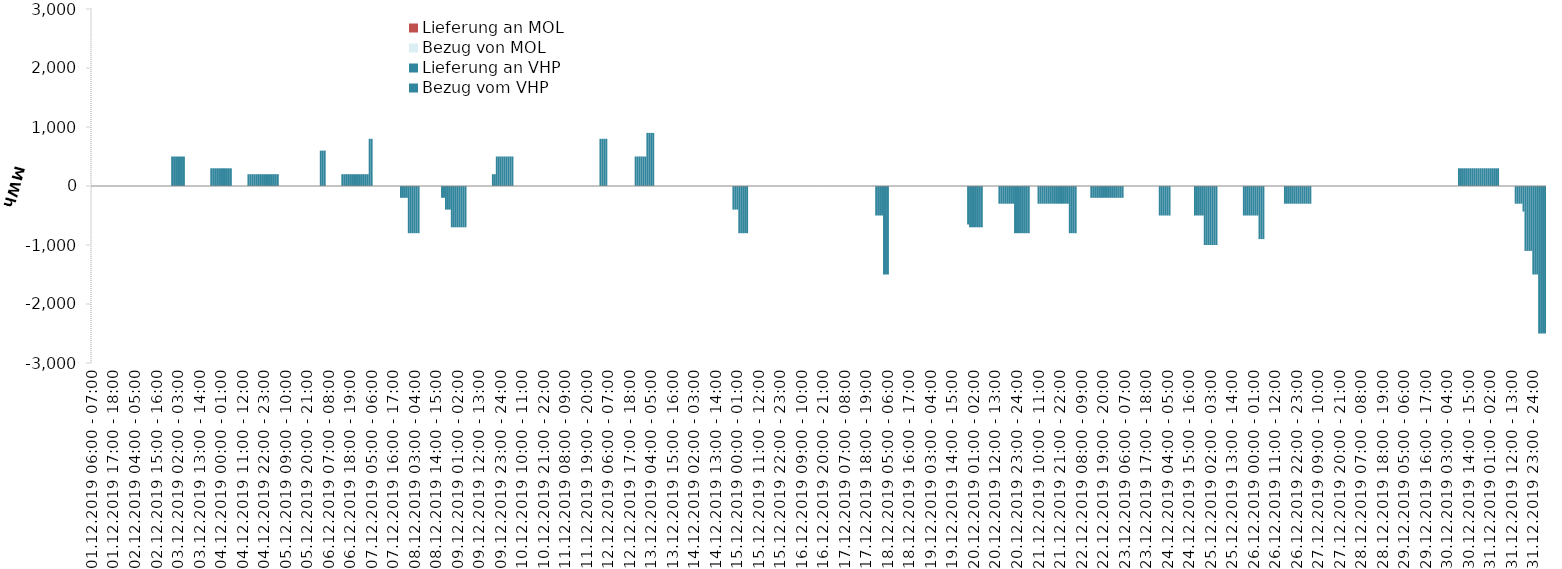
| Category | Bezug vom VHP | Lieferung an VHP | Bezug von MOL | Lieferung an MOL |
|---|---|---|---|---|
| 01.12.2019 06:00 - 07:00 | 0 | 0 | 0 | 0 |
| 01.12.2019 07:00 - 08:00 | 0 | 0 | 0 | 0 |
| 01.12.2019 08:00 - 09:00 | 0 | 0 | 0 | 0 |
| 01.12.2019 09:00 - 10:00 | 0 | 0 | 0 | 0 |
| 01.12.2019 10:00 - 11:00 | 0 | 0 | 0 | 0 |
| 01.12.2019 11:00 - 12:00 | 0 | 0 | 0 | 0 |
| 01.12.2019 12:00 - 13:00 | 0 | 0 | 0 | 0 |
| 01.12.2019 13:00 - 14:00 | 0 | 0 | 0 | 0 |
| 01.12.2019 14:00 - 15:00 | 0 | 0 | 0 | 0 |
| 01.12.2019 15:00 - 16:00 | 0 | 0 | 0 | 0 |
| 01.12.2019 16:00 - 17:00 | 0 | 0 | 0 | 0 |
| 01.12.2019 17:00 - 18:00 | 0 | 0 | 0 | 0 |
| 01.12.2019 18:00 - 19:00 | 0 | 0 | 0 | 0 |
| 01.12.2019 19:00 - 20:00 | 0 | 0 | 0 | 0 |
| 01.12.2019 20:00 - 21:00 | 0 | 0 | 0 | 0 |
| 01.12.2019 21:00 - 22:00 | 0 | 0 | 0 | 0 |
| 01.12.2019 22:00 - 23:00 | 0 | 0 | 0 | 0 |
| 01.12.2019 23:00 - 24:00 | 0 | 0 | 0 | 0 |
| 02.12.2019 00:00 - 01:00 | 0 | 0 | 0 | 0 |
| 02.12.2019 01:00 - 02:00 | 0 | 0 | 0 | 0 |
| 02.12.2019 02:00 - 03:00 | 0 | 0 | 0 | 0 |
| 02.12.2019 03:00 - 04:00 | 0 | 0 | 0 | 0 |
| 02.12.2019 04:00 - 05:00 | 0 | 0 | 0 | 0 |
| 02.12.2019 05:00 - 06:00 | 0 | 0 | 0 | 0 |
| 02.12.2019 06:00 - 07:00 | 0 | 0 | 0 | 0 |
| 02.12.2019 07:00 - 08:00 | 0 | 0 | 0 | 0 |
| 02.12.2019 08:00 - 09:00 | 0 | 0 | 0 | 0 |
| 02.12.2019 09:00 - 10:00 | 0 | 0 | 0 | 0 |
| 02.12.2019 10:00 - 11:00 | 0 | 0 | 0 | 0 |
| 02.12.2019 11:00 - 12:00 | 0 | 0 | 0 | 0 |
| 02.12.2019 12:00 - 13:00 | 0 | 0 | 0 | 0 |
| 02.12.2019 13:00 - 14:00 | 0 | 0 | 0 | 0 |
| 02.12.2019 14:00 - 15:00 | 0 | 0 | 0 | 0 |
| 02.12.2019 15:00 - 16:00 | 0 | 0 | 0 | 0 |
| 02.12.2019 16:00 - 17:00 | 0 | 0 | 0 | 0 |
| 02.12.2019 17:00 - 18:00 | 0 | 0 | 0 | 0 |
| 02.12.2019 18:00 - 19:00 | 0 | 0 | 0 | 0 |
| 02.12.2019 19:00 - 20:00 | 0 | 0 | 0 | 0 |
| 02.12.2019 20:00 - 21:00 | 0 | 0 | 0 | 0 |
| 02.12.2019 21:00 - 22:00 | 0 | 0 | 0 | 0 |
| 02.12.2019 22:00 - 23:00 | 0 | 0 | 0 | 0 |
| 02.12.2019 23:00 - 24:00 | 500 | 0 | 0 | 0 |
| 03.12.2019 00:00 - 01:00 | 500 | 0 | 0 | 0 |
| 03.12.2019 01:00 - 02:00 | 500 | 0 | 0 | 0 |
| 03.12.2019 02:00 - 03:00 | 500 | 0 | 0 | 0 |
| 03.12.2019 03:00 - 04:00 | 500 | 0 | 0 | 0 |
| 03.12.2019 04:00 - 05:00 | 500 | 0 | 0 | 0 |
| 03.12.2019 05:00 - 06:00 | 500 | 0 | 0 | 0 |
| 03.12.2019 06:00 - 07:00 | 0 | 0 | 0 | 0 |
| 03.12.2019 07:00 - 08:00 | 0 | 0 | 0 | 0 |
| 03.12.2019 08:00 - 09:00 | 0 | 0 | 0 | 0 |
| 03.12.2019 09:00 - 10:00 | 0 | 0 | 0 | 0 |
| 03.12.2019 10:00 - 11:00 | 0 | 0 | 0 | 0 |
| 03.12.2019 11:00 - 12:00 | 0 | 0 | 0 | 0 |
| 03.12.2019 12:00 - 13:00 | 0 | 0 | 0 | 0 |
| 03.12.2019 13:00 - 14:00 | 0 | 0 | 0 | 0 |
| 03.12.2019 14:00 - 15:00 | 0 | 0 | 0 | 0 |
| 03.12.2019 15:00 - 16:00 | 0 | 0 | 0 | 0 |
| 03.12.2019 16:00 - 17:00 | 0 | 0 | 0 | 0 |
| 03.12.2019 17:00 - 18:00 | 0 | 0 | 0 | 0 |
| 03.12.2019 18:00 - 19:00 | 0 | 0 | 0 | 0 |
| 03.12.2019 19:00 - 20:00 | 300 | 0 | 0 | 0 |
| 03.12.2019 20:00 - 21:00 | 300 | 0 | 0 | 0 |
| 03.12.2019 21:00 - 22:00 | 300 | 0 | 0 | 0 |
| 03.12.2019 22:00 - 23:00 | 300 | 0 | 0 | 0 |
| 03.12.2019 23:00 - 24:00 | 300 | 0 | 0 | 0 |
| 04.12.2019 00:00 - 01:00 | 300 | 0 | 0 | 0 |
| 04.12.2019 01:00 - 02:00 | 300 | 0 | 0 | 0 |
| 04.12.2019 02:00 - 03:00 | 300 | 0 | 0 | 0 |
| 04.12.2019 03:00 - 04:00 | 300 | 0 | 0 | 0 |
| 04.12.2019 04:00 - 05:00 | 300 | 0 | 0 | 0 |
| 04.12.2019 05:00 - 06:00 | 300 | 0 | 0 | 0 |
| 04.12.2019 06:00 - 07:00 | 0 | 0 | 0 | 0 |
| 04.12.2019 07:00 - 08:00 | 0 | 0 | 0 | 0 |
| 04.12.2019 08:00 - 09:00 | 0 | 0 | 0 | 0 |
| 04.12.2019 09:00 - 10:00 | 0 | 0 | 0 | 0 |
| 04.12.2019 10:00 - 11:00 | 0 | 0 | 0 | 0 |
| 04.12.2019 11:00 - 12:00 | 0 | 0 | 0 | 0 |
| 04.12.2019 12:00 - 13:00 | 0 | 0 | 0 | 0 |
| 04.12.2019 13:00 - 14:00 | 0 | 0 | 0 | 0 |
| 04.12.2019 14:00 - 15:00 | 200 | 0 | 0 | 0 |
| 04.12.2019 15:00 - 16:00 | 200 | 0 | 0 | 0 |
| 04.12.2019 16:00 - 17:00 | 200 | 0 | 0 | 0 |
| 04.12.2019 17:00 - 18:00 | 200 | 0 | 0 | 0 |
| 04.12.2019 18:00 - 19:00 | 200 | 0 | 0 | 0 |
| 04.12.2019 19:00 - 20:00 | 200 | 0 | 0 | 0 |
| 04.12.2019 20:00 - 21:00 | 200 | 0 | 0 | 0 |
| 04.12.2019 21:00 - 22:00 | 200 | 0 | 0 | 0 |
| 04.12.2019 22:00 - 23:00 | 200 | 0 | 0 | 0 |
| 04.12.2019 23:00 - 24:00 | 200 | 0 | 0 | 0 |
| 05.12.2019 00:00 - 01:00 | 200 | 0 | 0 | 0 |
| 05.12.2019 01:00 - 02:00 | 200 | 0 | 0 | 0 |
| 05.12.2019 02:00 - 03:00 | 200 | 0 | 0 | 0 |
| 05.12.2019 03:00 - 04:00 | 200 | 0 | 0 | 0 |
| 05.12.2019 04:00 - 05:00 | 200 | 0 | 0 | 0 |
| 05.12.2019 05:00 - 06:00 | 200 | 0 | 0 | 0 |
| 05.12.2019 06:00 - 07:00 | 0 | 0 | 0 | 0 |
| 05.12.2019 07:00 - 08:00 | 0 | 0 | 0 | 0 |
| 05.12.2019 08:00 - 09:00 | 0 | 0 | 0 | 0 |
| 05.12.2019 09:00 - 10:00 | 0 | 0 | 0 | 0 |
| 05.12.2019 10:00 - 11:00 | 0 | 0 | 0 | 0 |
| 05.12.2019 11:00 - 12:00 | 0 | 0 | 0 | 0 |
| 05.12.2019 12:00 - 13:00 | 0 | 0 | 0 | 0 |
| 05.12.2019 13:00 - 14:00 | 0 | 0 | 0 | 0 |
| 05.12.2019 14:00 - 15:00 | 0 | 0 | 0 | 0 |
| 05.12.2019 15:00 - 16:00 | 0 | 0 | 0 | 0 |
| 05.12.2019 16:00 - 17:00 | 0 | 0 | 0 | 0 |
| 05.12.2019 17:00 - 18:00 | 0 | 0 | 0 | 0 |
| 05.12.2019 18:00 - 19:00 | 0 | 0 | 0 | 0 |
| 05.12.2019 19:00 - 20:00 | 0 | 0 | 0 | 0 |
| 05.12.2019 20:00 - 21:00 | 0 | 0 | 0 | 0 |
| 05.12.2019 21:00 - 22:00 | 0 | 0 | 0 | 0 |
| 05.12.2019 22:00 - 23:00 | 0 | 0 | 0 | 0 |
| 05.12.2019 23:00 - 24:00 | 0 | 0 | 0 | 0 |
| 06.12.2019 00:00 - 01:00 | 0 | 0 | 0 | 0 |
| 06.12.2019 01:00 - 02:00 | 0 | 0 | 0 | 0 |
| 06.12.2019 02:00 - 03:00 | 0 | 0 | 0 | 0 |
| 06.12.2019 03:00 - 04:00 | 600 | 0 | 0 | 0 |
| 06.12.2019 04:00 - 05:00 | 600 | 0 | 0 | 0 |
| 06.12.2019 05:00 - 06:00 | 600 | 0 | 0 | 0 |
| 06.12.2019 06:00 - 07:00 | 0 | 0 | 0 | 0 |
| 06.12.2019 07:00 - 08:00 | 0 | 0 | 0 | 0 |
| 06.12.2019 08:00 - 09:00 | 0 | 0 | 0 | 0 |
| 06.12.2019 09:00 - 10:00 | 0 | 0 | 0 | 0 |
| 06.12.2019 10:00 - 11:00 | 0 | 0 | 0 | 0 |
| 06.12.2019 11:00 - 12:00 | 0 | 0 | 0 | 0 |
| 06.12.2019 12:00 - 13:00 | 0 | 0 | 0 | 0 |
| 06.12.2019 13:00 - 14:00 | 0 | 0 | 0 | 0 |
| 06.12.2019 14:00 - 15:00 | 200 | 0 | 0 | 0 |
| 06.12.2019 15:00 - 16:00 | 200 | 0 | 0 | 0 |
| 06.12.2019 16:00 - 17:00 | 200 | 0 | 0 | 0 |
| 06.12.2019 17:00 - 18:00 | 200 | 0 | 0 | 0 |
| 06.12.2019 18:00 - 19:00 | 200 | 0 | 0 | 0 |
| 06.12.2019 19:00 - 20:00 | 200 | 0 | 0 | 0 |
| 06.12.2019 20:00 - 21:00 | 200 | 0 | 0 | 0 |
| 06.12.2019 21:00 - 22:00 | 200 | 0 | 0 | 0 |
| 06.12.2019 22:00 - 23:00 | 200 | 0 | 0 | 0 |
| 06.12.2019 23:00 - 24:00 | 200 | 0 | 0 | 0 |
| 07.12.2019 00:00 - 01:00 | 200 | 0 | 0 | 0 |
| 07.12.2019 01:00 - 02:00 | 200 | 0 | 0 | 0 |
| 07.12.2019 02:00 - 03:00 | 200 | 0 | 0 | 0 |
| 07.12.2019 03:00 - 04:00 | 200 | 0 | 0 | 0 |
| 07.12.2019 04:00 - 05:00 | 800 | 0 | 0 | 0 |
| 07.12.2019 05:00 - 06:00 | 800 | 0 | 0 | 0 |
| 07.12.2019 06:00 - 07:00 | 0 | 0 | 0 | 0 |
| 07.12.2019 07:00 - 08:00 | 0 | 0 | 0 | 0 |
| 07.12.2019 08:00 - 09:00 | 0 | 0 | 0 | 0 |
| 07.12.2019 09:00 - 10:00 | 0 | 0 | 0 | 0 |
| 07.12.2019 10:00 - 11:00 | 0 | 0 | 0 | 0 |
| 07.12.2019 11:00 - 12:00 | 0 | 0 | 0 | 0 |
| 07.12.2019 12:00 - 13:00 | 0 | 0 | 0 | 0 |
| 07.12.2019 13:00 - 14:00 | 0 | 0 | 0 | 0 |
| 07.12.2019 14:00 - 15:00 | 0 | 0 | 0 | 0 |
| 07.12.2019 15:00 - 16:00 | 0 | 0 | 0 | 0 |
| 07.12.2019 16:00 - 17:00 | 0 | 0 | 0 | 0 |
| 07.12.2019 17:00 - 18:00 | 0 | 0 | 0 | 0 |
| 07.12.2019 18:00 - 19:00 | 0 | 0 | 0 | 0 |
| 07.12.2019 19:00 - 20:00 | 0 | 0 | 0 | 0 |
| 07.12.2019 20:00 - 21:00 | 0 | -200 | 0 | 0 |
| 07.12.2019 21:00 - 22:00 | 0 | -200 | 0 | 0 |
| 07.12.2019 22:00 - 23:00 | 0 | -200 | 0 | 0 |
| 07.12.2019 23:00 - 24:00 | 0 | -200 | 0 | 0 |
| 08.12.2019 00:00 - 01:00 | 0 | -800 | 0 | 0 |
| 08.12.2019 01:00 - 02:00 | 0 | -800 | 0 | 0 |
| 08.12.2019 02:00 - 03:00 | 0 | -800 | 0 | 0 |
| 08.12.2019 03:00 - 04:00 | 0 | -800 | 0 | 0 |
| 08.12.2019 04:00 - 05:00 | 0 | -800 | 0 | 0 |
| 08.12.2019 05:00 - 06:00 | 0 | -800 | 0 | 0 |
| 08.12.2019 06:00 - 07:00 | 0 | 0 | 0 | 0 |
| 08.12.2019 07:00 - 08:00 | 0 | 0 | 0 | 0 |
| 08.12.2019 08:00 - 09:00 | 0 | 0 | 0 | 0 |
| 08.12.2019 09:00 - 10:00 | 0 | 0 | 0 | 0 |
| 08.12.2019 10:00 - 11:00 | 0 | 0 | 0 | 0 |
| 08.12.2019 11:00 - 12:00 | 0 | 0 | 0 | 0 |
| 08.12.2019 12:00 - 13:00 | 0 | 0 | 0 | 0 |
| 08.12.2019 13:00 - 14:00 | 0 | 0 | 0 | 0 |
| 08.12.2019 14:00 - 15:00 | 0 | 0 | 0 | 0 |
| 08.12.2019 15:00 - 16:00 | 0 | 0 | 0 | 0 |
| 08.12.2019 16:00 - 17:00 | 0 | 0 | 0 | 0 |
| 08.12.2019 17:00 - 18:00 | 0 | -200 | 0 | 0 |
| 08.12.2019 18:00 - 19:00 | 0 | -200 | 0 | 0 |
| 08.12.2019 19:00 - 20:00 | 0 | -400 | 0 | 0 |
| 08.12.2019 20:00 - 21:00 | 0 | -400 | 0 | 0 |
| 08.12.2019 21:00 - 22:00 | 0 | -400 | 0 | 0 |
| 08.12.2019 22:00 - 23:00 | 0 | -700 | 0 | 0 |
| 08.12.2019 23:00 - 24:00 | 0 | -700 | 0 | 0 |
| 09.12.2019 00:00 - 01:00 | 0 | -700 | 0 | 0 |
| 09.12.2019 01:00 - 02:00 | 0 | -700 | 0 | 0 |
| 09.12.2019 02:00 - 03:00 | 0 | -700 | 0 | 0 |
| 09.12.2019 03:00 - 04:00 | 0 | -700 | 0 | 0 |
| 09.12.2019 04:00 - 05:00 | 0 | -700 | 0 | 0 |
| 09.12.2019 05:00 - 06:00 | 0 | -700 | 0 | 0 |
| 09.12.2019 06:00 - 07:00 | 0 | 0 | 0 | 0 |
| 09.12.2019 07:00 - 08:00 | 0 | 0 | 0 | 0 |
| 09.12.2019 08:00 - 09:00 | 0 | 0 | 0 | 0 |
| 09.12.2019 09:00 - 10:00 | 0 | 0 | 0 | 0 |
| 09.12.2019 10:00 - 11:00 | 0 | 0 | 0 | 0 |
| 09.12.2019 11:00 - 12:00 | 0 | 0 | 0 | 0 |
| 09.12.2019 12:00 - 13:00 | 0 | 0 | 0 | 0 |
| 09.12.2019 13:00 - 14:00 | 0 | 0 | 0 | 0 |
| 09.12.2019 14:00 - 15:00 | 0 | 0 | 0 | 0 |
| 09.12.2019 15:00 - 16:00 | 0 | 0 | 0 | 0 |
| 09.12.2019 16:00 - 17:00 | 0 | 0 | 0 | 0 |
| 09.12.2019 17:00 - 18:00 | 0 | 0 | 0 | 0 |
| 09.12.2019 18:00 - 19:00 | 0 | 0 | 0 | 0 |
| 09.12.2019 19:00 - 20:00 | 200 | 0 | 0 | 0 |
| 09.12.2019 20:00 - 21:00 | 200 | 0 | 0 | 0 |
| 09.12.2019 21:00 - 22:00 | 500 | 0 | 0 | 0 |
| 09.12.2019 22:00 - 23:00 | 500 | 0 | 0 | 0 |
| 09.12.2019 23:00 - 24:00 | 500 | 0 | 0 | 0 |
| 10.12.2019 00:00 - 01:00 | 500 | 0 | 0 | 0 |
| 10.12.2019 01:00 - 02:00 | 500 | 0 | 0 | 0 |
| 10.12.2019 02:00 - 03:00 | 500 | 0 | 0 | 0 |
| 10.12.2019 03:00 - 04:00 | 500 | 0 | 0 | 0 |
| 10.12.2019 04:00 - 05:00 | 500 | 0 | 0 | 0 |
| 10.12.2019 05:00 - 06:00 | 500 | 0 | 0 | 0 |
| 10.12.2019 06:00 - 07:00 | 0 | 0 | 0 | 0 |
| 10.12.2019 07:00 - 08:00 | 0 | 0 | 0 | 0 |
| 10.12.2019 08:00 - 09:00 | 0 | 0 | 0 | 0 |
| 10.12.2019 09:00 - 10:00 | 0 | 0 | 0 | 0 |
| 10.12.2019 10:00 - 11:00 | 0 | 0 | 0 | 0 |
| 10.12.2019 11:00 - 12:00 | 0 | 0 | 0 | 0 |
| 10.12.2019 12:00 - 13:00 | 0 | 0 | 0 | 0 |
| 10.12.2019 13:00 - 14:00 | 0 | 0 | 0 | 0 |
| 10.12.2019 14:00 - 15:00 | 0 | 0 | 0 | 0 |
| 10.12.2019 15:00 - 16:00 | 0 | 0 | 0 | 0 |
| 10.12.2019 16:00 - 17:00 | 0 | 0 | 0 | 0 |
| 10.12.2019 17:00 - 18:00 | 0 | 0 | 0 | 0 |
| 10.12.2019 18:00 - 19:00 | 0 | 0 | 0 | 0 |
| 10.12.2019 19:00 - 20:00 | 0 | 0 | 0 | 0 |
| 10.12.2019 20:00 - 21:00 | 0 | 0 | 0 | 0 |
| 10.12.2019 21:00 - 22:00 | 0 | 0 | 0 | 0 |
| 10.12.2019 22:00 - 23:00 | 0 | 0 | 0 | 0 |
| 10.12.2019 23:00 - 24:00 | 0 | 0 | 0 | 0 |
| 11.12.2019 00:00 - 01:00 | 0 | 0 | 0 | 0 |
| 11.12.2019 01:00 - 02:00 | 0 | 0 | 0 | 0 |
| 11.12.2019 02:00 - 03:00 | 0 | 0 | 0 | 0 |
| 11.12.2019 03:00 - 04:00 | 0 | 0 | 0 | 0 |
| 11.12.2019 04:00 - 05:00 | 0 | 0 | 0 | 0 |
| 11.12.2019 05:00 - 06:00 | 0 | 0 | 0 | 0 |
| 11.12.2019 06:00 - 07:00 | 0 | 0 | 0 | 0 |
| 11.12.2019 07:00 - 08:00 | 0 | 0 | 0 | 0 |
| 11.12.2019 08:00 - 09:00 | 0 | 0 | 0 | 0 |
| 11.12.2019 09:00 - 10:00 | 0 | 0 | 0 | 0 |
| 11.12.2019 10:00 - 11:00 | 0 | 0 | 0 | 0 |
| 11.12.2019 11:00 - 12:00 | 0 | 0 | 0 | 0 |
| 11.12.2019 12:00 - 13:00 | 0 | 0 | 0 | 0 |
| 11.12.2019 13:00 - 14:00 | 0 | 0 | 0 | 0 |
| 11.12.2019 14:00 - 15:00 | 0 | 0 | 0 | 0 |
| 11.12.2019 15:00 - 16:00 | 0 | 0 | 0 | 0 |
| 11.12.2019 16:00 - 17:00 | 0 | 0 | 0 | 0 |
| 11.12.2019 17:00 - 18:00 | 0 | 0 | 0 | 0 |
| 11.12.2019 18:00 - 19:00 | 0 | 0 | 0 | 0 |
| 11.12.2019 19:00 - 20:00 | 0 | 0 | 0 | 0 |
| 11.12.2019 20:00 - 21:00 | 0 | 0 | 0 | 0 |
| 11.12.2019 21:00 - 22:00 | 0 | 0 | 0 | 0 |
| 11.12.2019 22:00 - 23:00 | 0 | 0 | 0 | 0 |
| 11.12.2019 23:00 - 24:00 | 0 | 0 | 0 | 0 |
| 12.12.2019 00:00 - 01:00 | 0 | 0 | 0 | 0 |
| 12.12.2019 01:00 - 02:00 | 0 | 0 | 0 | 0 |
| 12.12.2019 02:00 - 03:00 | 800 | 0 | 0 | 0 |
| 12.12.2019 03:00 - 04:00 | 800 | 0 | 0 | 0 |
| 12.12.2019 04:00 - 05:00 | 800 | 0 | 0 | 0 |
| 12.12.2019 05:00 - 06:00 | 800 | 0 | 0 | 0 |
| 12.12.2019 06:00 - 07:00 | 0 | 0 | 0 | 0 |
| 12.12.2019 07:00 - 08:00 | 0 | 0 | 0 | 0 |
| 12.12.2019 08:00 - 09:00 | 0 | 0 | 0 | 0 |
| 12.12.2019 09:00 - 10:00 | 0 | 0 | 0 | 0 |
| 12.12.2019 10:00 - 11:00 | 0 | 0 | 0 | 0 |
| 12.12.2019 11:00 - 12:00 | 0 | 0 | 0 | 0 |
| 12.12.2019 12:00 - 13:00 | 0 | 0 | 0 | 0 |
| 12.12.2019 13:00 - 14:00 | 0 | 0 | 0 | 0 |
| 12.12.2019 14:00 - 15:00 | 0 | 0 | 0 | 0 |
| 12.12.2019 15:00 - 16:00 | 0 | 0 | 0 | 0 |
| 12.12.2019 16:00 - 17:00 | 0 | 0 | 0 | 0 |
| 12.12.2019 17:00 - 18:00 | 0 | 0 | 0 | 0 |
| 12.12.2019 18:00 - 19:00 | 0 | 0 | 0 | 0 |
| 12.12.2019 19:00 - 20:00 | 0 | 0 | 0 | 0 |
| 12.12.2019 20:00 - 21:00 | 500 | 0 | 0 | 0 |
| 12.12.2019 21:00 - 22:00 | 500 | 0 | 0 | 0 |
| 12.12.2019 22:00 - 23:00 | 500 | 0 | 0 | 0 |
| 12.12.2019 23:00 - 24:00 | 500 | 0 | 0 | 0 |
| 13.12.2019 00:00 - 01:00 | 500 | 0 | 0 | 0 |
| 13.12.2019 01:00 - 02:00 | 500 | 0 | 0 | 0 |
| 13.12.2019 02:00 - 03:00 | 900 | 0 | 0 | 0 |
| 13.12.2019 03:00 - 04:00 | 900 | 0 | 0 | 0 |
| 13.12.2019 04:00 - 05:00 | 900 | 0 | 0 | 0 |
| 13.12.2019 05:00 - 06:00 | 900 | 0 | 0 | 0 |
| 13.12.2019 06:00 - 07:00 | 0 | 0 | 0 | 0 |
| 13.12.2019 07:00 - 08:00 | 0 | 0 | 0 | 0 |
| 13.12.2019 08:00 - 09:00 | 0 | 0 | 0 | 0 |
| 13.12.2019 09:00 - 10:00 | 0 | 0 | 0 | 0 |
| 13.12.2019 10:00 - 11:00 | 0 | 0 | 0 | 0 |
| 13.12.2019 11:00 - 12:00 | 0 | 0 | 0 | 0 |
| 13.12.2019 12:00 - 13:00 | 0 | 0 | 0 | 0 |
| 13.12.2019 13:00 - 14:00 | 0 | 0 | 0 | 0 |
| 13.12.2019 14:00 - 15:00 | 0 | 0 | 0 | 0 |
| 13.12.2019 15:00 - 16:00 | 0 | 0 | 0 | 0 |
| 13.12.2019 16:00 - 17:00 | 0 | 0 | 0 | 0 |
| 13.12.2019 17:00 - 18:00 | 0 | 0 | 0 | 0 |
| 13.12.2019 18:00 - 19:00 | 0 | 0 | 0 | 0 |
| 13.12.2019 19:00 - 20:00 | 0 | 0 | 0 | 0 |
| 13.12.2019 20:00 - 21:00 | 0 | 0 | 0 | 0 |
| 13.12.2019 21:00 - 22:00 | 0 | 0 | 0 | 0 |
| 13.12.2019 22:00 - 23:00 | 0 | 0 | 0 | 0 |
| 13.12.2019 23:00 - 24:00 | 0 | 0 | 0 | 0 |
| 14.12.2019 00:00 - 01:00 | 0 | 0 | 0 | 0 |
| 14.12.2019 01:00 - 02:00 | 0 | 0 | 0 | 0 |
| 14.12.2019 02:00 - 03:00 | 0 | 0 | 0 | 0 |
| 14.12.2019 03:00 - 04:00 | 0 | 0 | 0 | 0 |
| 14.12.2019 04:00 - 05:00 | 0 | 0 | 0 | 0 |
| 14.12.2019 05:00 - 06:00 | 0 | 0 | 0 | 0 |
| 14.12.2019 06:00 - 07:00 | 0 | 0 | 0 | 0 |
| 14.12.2019 07:00 - 08:00 | 0 | 0 | 0 | 0 |
| 14.12.2019 08:00 - 09:00 | 0 | 0 | 0 | 0 |
| 14.12.2019 09:00 - 10:00 | 0 | 0 | 0 | 0 |
| 14.12.2019 10:00 - 11:00 | 0 | 0 | 0 | 0 |
| 14.12.2019 11:00 - 12:00 | 0 | 0 | 0 | 0 |
| 14.12.2019 12:00 - 13:00 | 0 | 0 | 0 | 0 |
| 14.12.2019 13:00 - 14:00 | 0 | 0 | 0 | 0 |
| 14.12.2019 14:00 - 15:00 | 0 | 0 | 0 | 0 |
| 14.12.2019 15:00 - 16:00 | 0 | 0 | 0 | 0 |
| 14.12.2019 16:00 - 17:00 | 0 | 0 | 0 | 0 |
| 14.12.2019 17:00 - 18:00 | 0 | 0 | 0 | 0 |
| 14.12.2019 18:00 - 19:00 | 0 | 0 | 0 | 0 |
| 14.12.2019 19:00 - 20:00 | 0 | 0 | 0 | 0 |
| 14.12.2019 20:00 - 21:00 | 0 | 0 | 0 | 0 |
| 14.12.2019 21:00 - 22:00 | 0 | 0 | 0 | 0 |
| 14.12.2019 22:00 - 23:00 | 0 | -400 | 0 | 0 |
| 14.12.2019 23:00 - 24:00 | 0 | -400 | 0 | 0 |
| 15.12.2019 00:00 - 01:00 | 0 | -400 | 0 | 0 |
| 15.12.2019 01:00 - 02:00 | 0 | -800 | 0 | 0 |
| 15.12.2019 02:00 - 03:00 | 0 | -800 | 0 | 0 |
| 15.12.2019 03:00 - 04:00 | 0 | -800 | 0 | 0 |
| 15.12.2019 04:00 - 05:00 | 0 | -800 | 0 | 0 |
| 15.12.2019 05:00 - 06:00 | 0 | -800 | 0 | 0 |
| 15.12.2019 06:00 - 07:00 | 0 | 0 | 0 | 0 |
| 15.12.2019 07:00 - 08:00 | 0 | 0 | 0 | 0 |
| 15.12.2019 08:00 - 09:00 | 0 | 0 | 0 | 0 |
| 15.12.2019 09:00 - 10:00 | 0 | 0 | 0 | 0 |
| 15.12.2019 10:00 - 11:00 | 0 | 0 | 0 | 0 |
| 15.12.2019 11:00 - 12:00 | 0 | 0 | 0 | 0 |
| 15.12.2019 12:00 - 13:00 | 0 | 0 | 0 | 0 |
| 15.12.2019 13:00 - 14:00 | 0 | 0 | 0 | 0 |
| 15.12.2019 14:00 - 15:00 | 0 | 0 | 0 | 0 |
| 15.12.2019 15:00 - 16:00 | 0 | 0 | 0 | 0 |
| 15.12.2019 16:00 - 17:00 | 0 | 0 | 0 | 0 |
| 15.12.2019 17:00 - 18:00 | 0 | 0 | 0 | 0 |
| 15.12.2019 18:00 - 19:00 | 0 | 0 | 0 | 0 |
| 15.12.2019 19:00 - 20:00 | 0 | 0 | 0 | 0 |
| 15.12.2019 20:00 - 21:00 | 0 | 0 | 0 | 0 |
| 15.12.2019 21:00 - 22:00 | 0 | 0 | 0 | 0 |
| 15.12.2019 22:00 - 23:00 | 0 | 0 | 0 | 0 |
| 15.12.2019 23:00 - 24:00 | 0 | 0 | 0 | 0 |
| 16.12.2019 00:00 - 01:00 | 0 | 0 | 0 | 0 |
| 16.12.2019 01:00 - 02:00 | 0 | 0 | 0 | 0 |
| 16.12.2019 02:00 - 03:00 | 0 | 0 | 0 | 0 |
| 16.12.2019 03:00 - 04:00 | 0 | 0 | 0 | 0 |
| 16.12.2019 04:00 - 05:00 | 0 | 0 | 0 | 0 |
| 16.12.2019 05:00 - 06:00 | 0 | 0 | 0 | 0 |
| 16.12.2019 06:00 - 07:00 | 0 | 0 | 0 | 0 |
| 16.12.2019 07:00 - 08:00 | 0 | 0 | 0 | 0 |
| 16.12.2019 08:00 - 09:00 | 0 | 0 | 0 | 0 |
| 16.12.2019 09:00 - 10:00 | 0 | 0 | 0 | 0 |
| 16.12.2019 10:00 - 11:00 | 0 | 0 | 0 | 0 |
| 16.12.2019 11:00 - 12:00 | 0 | 0 | 0 | 0 |
| 16.12.2019 12:00 - 13:00 | 0 | 0 | 0 | 0 |
| 16.12.2019 13:00 - 14:00 | 0 | 0 | 0 | 0 |
| 16.12.2019 14:00 - 15:00 | 0 | 0 | 0 | 0 |
| 16.12.2019 15:00 - 16:00 | 0 | 0 | 0 | 0 |
| 16.12.2019 16:00 - 17:00 | 0 | 0 | 0 | 0 |
| 16.12.2019 17:00 - 18:00 | 0 | 0 | 0 | 0 |
| 16.12.2019 18:00 - 19:00 | 0 | 0 | 0 | 0 |
| 16.12.2019 19:00 - 20:00 | 0 | 0 | 0 | 0 |
| 16.12.2019 20:00 - 21:00 | 0 | 0 | 0 | 0 |
| 16.12.2019 21:00 - 22:00 | 0 | 0 | 0 | 0 |
| 16.12.2019 22:00 - 23:00 | 0 | 0 | 0 | 0 |
| 16.12.2019 23:00 - 24:00 | 0 | 0 | 0 | 0 |
| 17.12.2019 00:00 - 01:00 | 0 | 0 | 0 | 0 |
| 17.12.2019 01:00 - 02:00 | 0 | 0 | 0 | 0 |
| 17.12.2019 02:00 - 03:00 | 0 | 0 | 0 | 0 |
| 17.12.2019 03:00 - 04:00 | 0 | 0 | 0 | 0 |
| 17.12.2019 04:00 - 05:00 | 0 | 0 | 0 | 0 |
| 17.12.2019 05:00 - 06:00 | 0 | 0 | 0 | 0 |
| 17.12.2019 06:00 - 07:00 | 0 | 0 | 0 | 0 |
| 17.12.2019 07:00 - 08:00 | 0 | 0 | 0 | 0 |
| 17.12.2019 08:00 - 09:00 | 0 | 0 | 0 | 0 |
| 17.12.2019 09:00 - 10:00 | 0 | 0 | 0 | 0 |
| 17.12.2019 10:00 - 11:00 | 0 | 0 | 0 | 0 |
| 17.12.2019 11:00 - 12:00 | 0 | 0 | 0 | 0 |
| 17.12.2019 12:00 - 13:00 | 0 | 0 | 0 | 0 |
| 17.12.2019 13:00 - 14:00 | 0 | 0 | 0 | 0 |
| 17.12.2019 14:00 - 15:00 | 0 | 0 | 0 | 0 |
| 17.12.2019 15:00 - 16:00 | 0 | 0 | 0 | 0 |
| 17.12.2019 16:00 - 17:00 | 0 | 0 | 0 | 0 |
| 17.12.2019 17:00 - 18:00 | 0 | 0 | 0 | 0 |
| 17.12.2019 18:00 - 19:00 | 0 | 0 | 0 | 0 |
| 17.12.2019 19:00 - 20:00 | 0 | 0 | 0 | 0 |
| 17.12.2019 20:00 - 21:00 | 0 | 0 | 0 | 0 |
| 17.12.2019 21:00 - 22:00 | 0 | 0 | 0 | 0 |
| 17.12.2019 22:00 - 23:00 | 0 | 0 | 0 | 0 |
| 17.12.2019 23:00 - 24:00 | 0 | -500 | 0 | 0 |
| 18.12.2019 00:00 - 01:00 | 0 | -500 | 0 | 0 |
| 18.12.2019 01:00 - 02:00 | 0 | -500 | 0 | 0 |
| 18.12.2019 02:00 - 03:00 | 0 | -500 | 0 | 0 |
| 18.12.2019 03:00 - 04:00 | 0 | -1500 | 0 | 0 |
| 18.12.2019 04:00 - 05:00 | 0 | -1500 | 0 | 0 |
| 18.12.2019 05:00 - 06:00 | 0 | -1500 | 0 | 0 |
| 18.12.2019 06:00 - 07:00 | 0 | 0 | 0 | 0 |
| 18.12.2019 07:00 - 08:00 | 0 | 0 | 0 | 0 |
| 18.12.2019 08:00 - 09:00 | 0 | 0 | 0 | 0 |
| 18.12.2019 09:00 - 10:00 | 0 | 0 | 0 | 0 |
| 18.12.2019 10:00 - 11:00 | 0 | 0 | 0 | 0 |
| 18.12.2019 11:00 - 12:00 | 0 | 0 | 0 | 0 |
| 18.12.2019 12:00 - 13:00 | 0 | 0 | 0 | 0 |
| 18.12.2019 13:00 - 14:00 | 0 | 0 | 0 | 0 |
| 18.12.2019 14:00 - 15:00 | 0 | 0 | 0 | 0 |
| 18.12.2019 15:00 - 16:00 | 0 | 0 | 0 | 0 |
| 18.12.2019 16:00 - 17:00 | 0 | 0 | 0 | 0 |
| 18.12.2019 17:00 - 18:00 | 0 | 0 | 0 | 0 |
| 18.12.2019 18:00 - 19:00 | 0 | 0 | 0 | 0 |
| 18.12.2019 19:00 - 20:00 | 0 | 0 | 0 | 0 |
| 18.12.2019 20:00 - 21:00 | 0 | 0 | 0 | 0 |
| 18.12.2019 21:00 - 22:00 | 0 | 0 | 0 | 0 |
| 18.12.2019 22:00 - 23:00 | 0 | 0 | 0 | 0 |
| 18.12.2019 23:00 - 24:00 | 0 | 0 | 0 | 0 |
| 19.12.2019 00:00 - 01:00 | 0 | 0 | 0 | 0 |
| 19.12.2019 01:00 - 02:00 | 0 | 0 | 0 | 0 |
| 19.12.2019 02:00 - 03:00 | 0 | 0 | 0 | 0 |
| 19.12.2019 03:00 - 04:00 | 0 | 0 | 0 | 0 |
| 19.12.2019 04:00 - 05:00 | 0 | 0 | 0 | 0 |
| 19.12.2019 05:00 - 06:00 | 0 | 0 | 0 | 0 |
| 19.12.2019 06:00 - 07:00 | 0 | 0 | 0 | 0 |
| 19.12.2019 07:00 - 08:00 | 0 | 0 | 0 | 0 |
| 19.12.2019 08:00 - 09:00 | 0 | 0 | 0 | 0 |
| 19.12.2019 09:00 - 10:00 | 0 | 0 | 0 | 0 |
| 19.12.2019 10:00 - 11:00 | 0 | 0 | 0 | 0 |
| 19.12.2019 11:00 - 12:00 | 0 | 0 | 0 | 0 |
| 19.12.2019 12:00 - 13:00 | 0 | 0 | 0 | 0 |
| 19.12.2019 13:00 - 14:00 | 0 | 0 | 0 | 0 |
| 19.12.2019 14:00 - 15:00 | 0 | 0 | 0 | 0 |
| 19.12.2019 15:00 - 16:00 | 0 | 0 | 0 | 0 |
| 19.12.2019 16:00 - 17:00 | 0 | 0 | 0 | 0 |
| 19.12.2019 17:00 - 18:00 | 0 | 0 | 0 | 0 |
| 19.12.2019 18:00 - 19:00 | 0 | 0 | 0 | 0 |
| 19.12.2019 19:00 - 20:00 | 0 | 0 | 0 | 0 |
| 19.12.2019 20:00 - 21:00 | 0 | 0 | 0 | 0 |
| 19.12.2019 21:00 - 22:00 | 0 | 0 | 0 | 0 |
| 19.12.2019 22:00 - 23:00 | 0 | -652 | 0 | 0 |
| 19.12.2019 23:00 - 24:00 | 0 | -700 | 0 | 0 |
| 20.12.2019 00:00 - 01:00 | 0 | -700 | 0 | 0 |
| 20.12.2019 01:00 - 02:00 | 0 | -700 | 0 | 0 |
| 20.12.2019 02:00 - 03:00 | 0 | -700 | 0 | 0 |
| 20.12.2019 03:00 - 04:00 | 0 | -700 | 0 | 0 |
| 20.12.2019 04:00 - 05:00 | 0 | -700 | 0 | 0 |
| 20.12.2019 05:00 - 06:00 | 0 | -700 | 0 | 0 |
| 20.12.2019 06:00 - 07:00 | 0 | 0 | 0 | 0 |
| 20.12.2019 07:00 - 08:00 | 0 | 0 | 0 | 0 |
| 20.12.2019 08:00 - 09:00 | 0 | 0 | 0 | 0 |
| 20.12.2019 09:00 - 10:00 | 0 | 0 | 0 | 0 |
| 20.12.2019 10:00 - 11:00 | 0 | 0 | 0 | 0 |
| 20.12.2019 11:00 - 12:00 | 0 | 0 | 0 | 0 |
| 20.12.2019 12:00 - 13:00 | 0 | 0 | 0 | 0 |
| 20.12.2019 13:00 - 14:00 | 0 | 0 | 0 | 0 |
| 20.12.2019 14:00 - 15:00 | 0 | -300 | 0 | 0 |
| 20.12.2019 15:00 - 16:00 | 0 | -300 | 0 | 0 |
| 20.12.2019 16:00 - 17:00 | 0 | -300 | 0 | 0 |
| 20.12.2019 17:00 - 18:00 | 0 | -300 | 0 | 0 |
| 20.12.2019 18:00 - 19:00 | 0 | -300 | 0 | 0 |
| 20.12.2019 19:00 - 20:00 | 0 | -300 | 0 | 0 |
| 20.12.2019 20:00 - 21:00 | 0 | -300 | 0 | 0 |
| 20.12.2019 21:00 - 22:00 | 0 | -300 | 0 | 0 |
| 20.12.2019 22:00 - 23:00 | 0 | -800 | 0 | 0 |
| 20.12.2019 23:00 - 24:00 | 0 | -800 | 0 | 0 |
| 21.12.2019 00:00 - 01:00 | 0 | -800 | 0 | 0 |
| 21.12.2019 01:00 - 02:00 | 0 | -800 | 0 | 0 |
| 21.12.2019 02:00 - 03:00 | 0 | -800 | 0 | 0 |
| 21.12.2019 03:00 - 04:00 | 0 | -800 | 0 | 0 |
| 21.12.2019 04:00 - 05:00 | 0 | -800 | 0 | 0 |
| 21.12.2019 05:00 - 06:00 | 0 | -800 | 0 | 0 |
| 21.12.2019 06:00 - 07:00 | 0 | 0 | 0 | 0 |
| 21.12.2019 07:00 - 08:00 | 0 | 0 | 0 | 0 |
| 21.12.2019 08:00 - 09:00 | 0 | 0 | 0 | 0 |
| 21.12.2019 09:00 - 10:00 | 0 | 0 | 0 | 0 |
| 21.12.2019 10:00 - 11:00 | 0 | -300 | 0 | 0 |
| 21.12.2019 11:00 - 12:00 | 0 | -300 | 0 | 0 |
| 21.12.2019 12:00 - 13:00 | 0 | -300 | 0 | 0 |
| 21.12.2019 13:00 - 14:00 | 0 | -300 | 0 | 0 |
| 21.12.2019 14:00 - 15:00 | 0 | -300 | 0 | 0 |
| 21.12.2019 15:00 - 16:00 | 0 | -300 | 0 | 0 |
| 21.12.2019 16:00 - 17:00 | 0 | -300 | 0 | 0 |
| 21.12.2019 17:00 - 18:00 | 0 | -300 | 0 | 0 |
| 21.12.2019 18:00 - 19:00 | 0 | -300 | 0 | 0 |
| 21.12.2019 19:00 - 20:00 | 0 | -300 | 0 | 0 |
| 21.12.2019 20:00 - 21:00 | 0 | -300 | 0 | 0 |
| 21.12.2019 21:00 - 22:00 | 0 | -300 | 0 | 0 |
| 21.12.2019 22:00 - 23:00 | 0 | -300 | 0 | 0 |
| 21.12.2019 23:00 - 24:00 | 0 | -300 | 0 | 0 |
| 22.12.2019 00:00 - 01:00 | 0 | -300 | 0 | 0 |
| 22.12.2019 01:00 - 02:00 | 0 | -300 | 0 | 0 |
| 22.12.2019 02:00 - 03:00 | 0 | -800 | 0 | 0 |
| 22.12.2019 03:00 - 04:00 | 0 | -800 | 0 | 0 |
| 22.12.2019 04:00 - 05:00 | 0 | -800 | 0 | 0 |
| 22.12.2019 05:00 - 06:00 | 0 | -800 | 0 | 0 |
| 22.12.2019 06:00 - 07:00 | 0 | 0 | 0 | 0 |
| 22.12.2019 07:00 - 08:00 | 0 | 0 | 0 | 0 |
| 22.12.2019 08:00 - 09:00 | 0 | 0 | 0 | 0 |
| 22.12.2019 09:00 - 10:00 | 0 | 0 | 0 | 0 |
| 22.12.2019 10:00 - 11:00 | 0 | 0 | 0 | 0 |
| 22.12.2019 11:00 - 12:00 | 0 | 0 | 0 | 0 |
| 22.12.2019 12:00 - 13:00 | 0 | 0 | 0 | 0 |
| 22.12.2019 13:00 - 14:00 | 0 | -200 | 0 | 0 |
| 22.12.2019 14:00 - 15:00 | 0 | -200 | 0 | 0 |
| 22.12.2019 15:00 - 16:00 | 0 | -200 | 0 | 0 |
| 22.12.2019 16:00 - 17:00 | 0 | -200 | 0 | 0 |
| 22.12.2019 17:00 - 18:00 | 0 | -200 | 0 | 0 |
| 22.12.2019 18:00 - 19:00 | 0 | -200 | 0 | 0 |
| 22.12.2019 19:00 - 20:00 | 0 | -200 | 0 | 0 |
| 22.12.2019 20:00 - 21:00 | 0 | -200 | 0 | 0 |
| 22.12.2019 21:00 - 22:00 | 0 | -200 | 0 | 0 |
| 22.12.2019 22:00 - 23:00 | 0 | -200 | 0 | 0 |
| 22.12.2019 23:00 - 24:00 | 0 | -200 | 0 | 0 |
| 23.12.2019 00:00 - 01:00 | 0 | -200 | 0 | 0 |
| 23.12.2019 01:00 - 02:00 | 0 | -200 | 0 | 0 |
| 23.12.2019 02:00 - 03:00 | 0 | -200 | 0 | 0 |
| 23.12.2019 03:00 - 04:00 | 0 | -200 | 0 | 0 |
| 23.12.2019 04:00 - 05:00 | 0 | -200 | 0 | 0 |
| 23.12.2019 05:00 - 06:00 | 0 | -200 | 0 | 0 |
| 23.12.2019 06:00 - 07:00 | 0 | 0 | 0 | 0 |
| 23.12.2019 07:00 - 08:00 | 0 | 0 | 0 | 0 |
| 23.12.2019 08:00 - 09:00 | 0 | 0 | 0 | 0 |
| 23.12.2019 09:00 - 10:00 | 0 | 0 | 0 | 0 |
| 23.12.2019 10:00 - 11:00 | 0 | 0 | 0 | 0 |
| 23.12.2019 11:00 - 12:00 | 0 | 0 | 0 | 0 |
| 23.12.2019 12:00 - 13:00 | 0 | 0 | 0 | 0 |
| 23.12.2019 13:00 - 14:00 | 0 | 0 | 0 | 0 |
| 23.12.2019 14:00 - 15:00 | 0 | 0 | 0 | 0 |
| 23.12.2019 15:00 - 16:00 | 0 | 0 | 0 | 0 |
| 23.12.2019 16:00 - 17:00 | 0 | 0 | 0 | 0 |
| 23.12.2019 17:00 - 18:00 | 0 | 0 | 0 | 0 |
| 23.12.2019 18:00 - 19:00 | 0 | 0 | 0 | 0 |
| 23.12.2019 19:00 - 20:00 | 0 | 0 | 0 | 0 |
| 23.12.2019 20:00 - 21:00 | 0 | 0 | 0 | 0 |
| 23.12.2019 21:00 - 22:00 | 0 | 0 | 0 | 0 |
| 23.12.2019 22:00 - 23:00 | 0 | 0 | 0 | 0 |
| 23.12.2019 23:00 - 24:00 | 0 | 0 | 0 | 0 |
| 24.12.2019 00:00 - 01:00 | 0 | -500 | 0 | 0 |
| 24.12.2019 01:00 - 02:00 | 0 | -500 | 0 | 0 |
| 24.12.2019 02:00 - 03:00 | 0 | -500 | 0 | 0 |
| 24.12.2019 03:00 - 04:00 | 0 | -500 | 0 | 0 |
| 24.12.2019 04:00 - 05:00 | 0 | -500 | 0 | 0 |
| 24.12.2019 05:00 - 06:00 | 0 | -500 | 0 | 0 |
| 24.12.2019 06:00 - 07:00 | 0 | 0 | 0 | 0 |
| 24.12.2019 07:00 - 08:00 | 0 | 0 | 0 | 0 |
| 24.12.2019 08:00 - 09:00 | 0 | 0 | 0 | 0 |
| 24.12.2019 09:00 - 10:00 | 0 | 0 | 0 | 0 |
| 24.12.2019 10:00 - 11:00 | 0 | 0 | 0 | 0 |
| 24.12.2019 11:00 - 12:00 | 0 | 0 | 0 | 0 |
| 24.12.2019 12:00 - 13:00 | 0 | 0 | 0 | 0 |
| 24.12.2019 13:00 - 14:00 | 0 | 0 | 0 | 0 |
| 24.12.2019 14:00 - 15:00 | 0 | 0 | 0 | 0 |
| 24.12.2019 15:00 - 16:00 | 0 | 0 | 0 | 0 |
| 24.12.2019 16:00 - 17:00 | 0 | 0 | 0 | 0 |
| 24.12.2019 17:00 - 18:00 | 0 | 0 | 0 | 0 |
| 24.12.2019 18:00 - 19:00 | 0 | -500 | 0 | 0 |
| 24.12.2019 19:00 - 20:00 | 0 | -500 | 0 | 0 |
| 24.12.2019 20:00 - 21:00 | 0 | -500 | 0 | 0 |
| 24.12.2019 21:00 - 22:00 | 0 | -500 | 0 | 0 |
| 24.12.2019 22:00 - 23:00 | 0 | -500 | 0 | 0 |
| 24.12.2019 23:00 - 24:00 | 0 | -1000 | 0 | 0 |
| 25.12.2019 00:00 - 01:00 | 0 | -1000 | 0 | 0 |
| 25.12.2019 01:00 - 02:00 | 0 | -1000 | 0 | 0 |
| 25.12.2019 02:00 - 03:00 | 0 | -1000 | 0 | 0 |
| 25.12.2019 03:00 - 04:00 | 0 | -1000 | 0 | 0 |
| 25.12.2019 04:00 - 05:00 | 0 | -1000 | 0 | 0 |
| 25.12.2019 05:00 - 06:00 | 0 | -1000 | 0 | 0 |
| 25.12.2019 06:00 - 07:00 | 0 | 0 | 0 | 0 |
| 25.12.2019 07:00 - 08:00 | 0 | 0 | 0 | 0 |
| 25.12.2019 08:00 - 09:00 | 0 | 0 | 0 | 0 |
| 25.12.2019 09:00 - 10:00 | 0 | 0 | 0 | 0 |
| 25.12.2019 10:00 - 11:00 | 0 | 0 | 0 | 0 |
| 25.12.2019 11:00 - 12:00 | 0 | 0 | 0 | 0 |
| 25.12.2019 12:00 - 13:00 | 0 | 0 | 0 | 0 |
| 25.12.2019 13:00 - 14:00 | 0 | 0 | 0 | 0 |
| 25.12.2019 14:00 - 15:00 | 0 | 0 | 0 | 0 |
| 25.12.2019 15:00 - 16:00 | 0 | 0 | 0 | 0 |
| 25.12.2019 16:00 - 17:00 | 0 | 0 | 0 | 0 |
| 25.12.2019 17:00 - 18:00 | 0 | 0 | 0 | 0 |
| 25.12.2019 18:00 - 19:00 | 0 | 0 | 0 | 0 |
| 25.12.2019 19:00 - 20:00 | 0 | -500 | 0 | 0 |
| 25.12.2019 20:00 - 21:00 | 0 | -500 | 0 | 0 |
| 25.12.2019 21:00 - 22:00 | 0 | -500 | 0 | 0 |
| 25.12.2019 22:00 - 23:00 | 0 | -500 | 0 | 0 |
| 25.12.2019 23:00 - 24:00 | 0 | -500 | 0 | 0 |
| 26.12.2019 00:00 - 01:00 | 0 | -500 | 0 | 0 |
| 26.12.2019 01:00 - 02:00 | 0 | -500 | 0 | 0 |
| 26.12.2019 02:00 - 03:00 | 0 | -500 | 0 | 0 |
| 26.12.2019 03:00 - 04:00 | 0 | -900 | 0 | 0 |
| 26.12.2019 04:00 - 05:00 | 0 | -900 | 0 | 0 |
| 26.12.2019 05:00 - 06:00 | 0 | -900 | 0 | 0 |
| 26.12.2019 06:00 - 07:00 | 0 | 0 | 0 | 0 |
| 26.12.2019 07:00 - 08:00 | 0 | 0 | 0 | 0 |
| 26.12.2019 08:00 - 09:00 | 0 | 0 | 0 | 0 |
| 26.12.2019 09:00 - 10:00 | 0 | 0 | 0 | 0 |
| 26.12.2019 10:00 - 11:00 | 0 | 0 | 0 | 0 |
| 26.12.2019 11:00 - 12:00 | 0 | 0 | 0 | 0 |
| 26.12.2019 12:00 - 13:00 | 0 | 0 | 0 | 0 |
| 26.12.2019 13:00 - 14:00 | 0 | 0 | 0 | 0 |
| 26.12.2019 14:00 - 15:00 | 0 | 0 | 0 | 0 |
| 26.12.2019 15:00 - 16:00 | 0 | 0 | 0 | 0 |
| 26.12.2019 16:00 - 17:00 | 0 | -300 | 0 | 0 |
| 26.12.2019 17:00 - 18:00 | 0 | -300 | 0 | 0 |
| 26.12.2019 18:00 - 19:00 | 0 | -300 | 0 | 0 |
| 26.12.2019 19:00 - 20:00 | 0 | -300 | 0 | 0 |
| 26.12.2019 20:00 - 21:00 | 0 | -300 | 0 | 0 |
| 26.12.2019 21:00 - 22:00 | 0 | -300 | 0 | 0 |
| 26.12.2019 22:00 - 23:00 | 0 | -300 | 0 | 0 |
| 26.12.2019 23:00 - 24:00 | 0 | -300 | 0 | 0 |
| 27.12.2019 00:00 - 01:00 | 0 | -300 | 0 | 0 |
| 27.12.2019 01:00 - 02:00 | 0 | -300 | 0 | 0 |
| 27.12.2019 02:00 - 03:00 | 0 | -300 | 0 | 0 |
| 27.12.2019 03:00 - 04:00 | 0 | -300 | 0 | 0 |
| 27.12.2019 04:00 - 05:00 | 0 | -300 | 0 | 0 |
| 27.12.2019 05:00 - 06:00 | 0 | -300 | 0 | 0 |
| 27.12.2019 06:00 - 07:00 | 0 | 0 | 0 | 0 |
| 27.12.2019 07:00 - 08:00 | 0 | 0 | 0 | 0 |
| 27.12.2019 08:00 - 09:00 | 0 | 0 | 0 | 0 |
| 27.12.2019 09:00 - 10:00 | 0 | 0 | 0 | 0 |
| 27.12.2019 10:00 - 11:00 | 0 | 0 | 0 | 0 |
| 27.12.2019 11:00 - 12:00 | 0 | 0 | 0 | 0 |
| 27.12.2019 12:00 - 13:00 | 0 | 0 | 0 | 0 |
| 27.12.2019 13:00 - 14:00 | 0 | 0 | 0 | 0 |
| 27.12.2019 14:00 - 15:00 | 0 | 0 | 0 | 0 |
| 27.12.2019 15:00 - 16:00 | 0 | 0 | 0 | 0 |
| 27.12.2019 16:00 - 17:00 | 0 | 0 | 0 | 0 |
| 27.12.2019 17:00 - 18:00 | 0 | 0 | 0 | 0 |
| 27.12.2019 18:00 - 19:00 | 0 | 0 | 0 | 0 |
| 27.12.2019 19:00 - 20:00 | 0 | 0 | 0 | 0 |
| 27.12.2019 20:00 - 21:00 | 0 | 0 | 0 | 0 |
| 27.12.2019 21:00 - 22:00 | 0 | 0 | 0 | 0 |
| 27.12.2019 22:00 - 23:00 | 0 | 0 | 0 | 0 |
| 27.12.2019 23:00 - 24:00 | 0 | 0 | 0 | 0 |
| 28.12.2019 00:00 - 01:00 | 0 | 0 | 0 | 0 |
| 28.12.2019 01:00 - 02:00 | 0 | 0 | 0 | 0 |
| 28.12.2019 02:00 - 03:00 | 0 | 0 | 0 | 0 |
| 28.12.2019 03:00 - 04:00 | 0 | 0 | 0 | 0 |
| 28.12.2019 04:00 - 05:00 | 0 | 0 | 0 | 0 |
| 28.12.2019 05:00 - 06:00 | 0 | 0 | 0 | 0 |
| 28.12.2019 06:00 - 07:00 | 0 | 0 | 0 | 0 |
| 28.12.2019 07:00 - 08:00 | 0 | 0 | 0 | 0 |
| 28.12.2019 08:00 - 09:00 | 0 | 0 | 0 | 0 |
| 28.12.2019 09:00 - 10:00 | 0 | 0 | 0 | 0 |
| 28.12.2019 10:00 - 11:00 | 0 | 0 | 0 | 0 |
| 28.12.2019 11:00 - 12:00 | 0 | 0 | 0 | 0 |
| 28.12.2019 12:00 - 13:00 | 0 | 0 | 0 | 0 |
| 28.12.2019 13:00 - 14:00 | 0 | 0 | 0 | 0 |
| 28.12.2019 14:00 - 15:00 | 0 | 0 | 0 | 0 |
| 28.12.2019 15:00 - 16:00 | 0 | 0 | 0 | 0 |
| 28.12.2019 16:00 - 17:00 | 0 | 0 | 0 | 0 |
| 28.12.2019 17:00 - 18:00 | 0 | 0 | 0 | 0 |
| 28.12.2019 18:00 - 19:00 | 0 | 0 | 0 | 0 |
| 28.12.2019 19:00 - 20:00 | 0 | 0 | 0 | 0 |
| 28.12.2019 20:00 - 21:00 | 0 | 0 | 0 | 0 |
| 28.12.2019 21:00 - 22:00 | 0 | 0 | 0 | 0 |
| 28.12.2019 22:00 - 23:00 | 0 | 0 | 0 | 0 |
| 28.12.2019 23:00 - 24:00 | 0 | 0 | 0 | 0 |
| 29.12.2019 00:00 - 01:00 | 0 | 0 | 0 | 0 |
| 29.12.2019 01:00 - 02:00 | 0 | 0 | 0 | 0 |
| 29.12.2019 02:00 - 03:00 | 0 | 0 | 0 | 0 |
| 29.12.2019 03:00 - 04:00 | 0 | 0 | 0 | 0 |
| 29.12.2019 04:00 - 05:00 | 0 | 0 | 0 | 0 |
| 29.12.2019 05:00 - 06:00 | 0 | 0 | 0 | 0 |
| 29.12.2019 06:00 - 07:00 | 0 | 0 | 0 | 0 |
| 29.12.2019 07:00 - 08:00 | 0 | 0 | 0 | 0 |
| 29.12.2019 08:00 - 09:00 | 0 | 0 | 0 | 0 |
| 29.12.2019 09:00 - 10:00 | 0 | 0 | 0 | 0 |
| 29.12.2019 10:00 - 11:00 | 0 | 0 | 0 | 0 |
| 29.12.2019 11:00 - 12:00 | 0 | 0 | 0 | 0 |
| 29.12.2019 12:00 - 13:00 | 0 | 0 | 0 | 0 |
| 29.12.2019 13:00 - 14:00 | 0 | 0 | 0 | 0 |
| 29.12.2019 14:00 - 15:00 | 0 | 0 | 0 | 0 |
| 29.12.2019 15:00 - 16:00 | 0 | 0 | 0 | 0 |
| 29.12.2019 16:00 - 17:00 | 0 | 0 | 0 | 0 |
| 29.12.2019 17:00 - 18:00 | 0 | 0 | 0 | 0 |
| 29.12.2019 18:00 - 19:00 | 0 | 0 | 0 | 0 |
| 29.12.2019 19:00 - 20:00 | 0 | 0 | 0 | 0 |
| 29.12.2019 20:00 - 21:00 | 0 | 0 | 0 | 0 |
| 29.12.2019 21:00 - 22:00 | 0 | 0 | 0 | 0 |
| 29.12.2019 22:00 - 23:00 | 0 | 0 | 0 | 0 |
| 29.12.2019 23:00 - 24:00 | 0 | 0 | 0 | 0 |
| 30.12.2019 00:00 - 01:00 | 0 | 0 | 0 | 0 |
| 30.12.2019 01:00 - 02:00 | 0 | 0 | 0 | 0 |
| 30.12.2019 02:00 - 03:00 | 0 | 0 | 0 | 0 |
| 30.12.2019 03:00 - 04:00 | 0 | 0 | 0 | 0 |
| 30.12.2019 04:00 - 05:00 | 0 | 0 | 0 | 0 |
| 30.12.2019 05:00 - 06:00 | 0 | 0 | 0 | 0 |
| 30.12.2019 06:00 - 07:00 | 0 | 0 | 0 | 0 |
| 30.12.2019 07:00 - 08:00 | 0 | 0 | 0 | 0 |
| 30.12.2019 08:00 - 09:00 | 0 | 0 | 0 | 0 |
| 30.12.2019 09:00 - 10:00 | 300 | 0 | 0 | 0 |
| 30.12.2019 10:00 - 11:00 | 300 | 0 | 0 | 0 |
| 30.12.2019 11:00 - 12:00 | 300 | 0 | 0 | 0 |
| 30.12.2019 12:00 - 13:00 | 300 | 0 | 0 | 0 |
| 30.12.2019 13:00 - 14:00 | 300 | 0 | 0 | 0 |
| 30.12.2019 14:00 - 15:00 | 300 | 0 | 0 | 0 |
| 30.12.2019 15:00 - 16:00 | 300 | 0 | 0 | 0 |
| 30.12.2019 16:00 - 17:00 | 300 | 0 | 0 | 0 |
| 30.12.2019 17:00 - 18:00 | 300 | 0 | 0 | 0 |
| 30.12.2019 18:00 - 19:00 | 300 | 0 | 0 | 0 |
| 30.12.2019 19:00 - 20:00 | 300 | 0 | 0 | 0 |
| 30.12.2019 20:00 - 21:00 | 300 | 0 | 0 | 0 |
| 30.12.2019 21:00 - 22:00 | 300 | 0 | 0 | 0 |
| 30.12.2019 22:00 - 23:00 | 300 | 0 | 0 | 0 |
| 30.12.2019 23:00 - 24:00 | 300 | 0 | 0 | 0 |
| 31.12.2019 00:00 - 01:00 | 300 | 0 | 0 | 0 |
| 31.12.2019 01:00 - 02:00 | 300 | 0 | 0 | 0 |
| 31.12.2019 02:00 - 03:00 | 300 | 0 | 0 | 0 |
| 31.12.2019 03:00 - 04:00 | 300 | 0 | 0 | 0 |
| 31.12.2019 04:00 - 05:00 | 300 | 0 | 0 | 0 |
| 31.12.2019 05:00 - 06:00 | 300 | 0 | 0 | 0 |
| 31.12.2019 06:00 - 07:00 | 0 | 0 | 0 | 0 |
| 31.12.2019 07:00 - 08:00 | 0 | 0 | 0 | 0 |
| 31.12.2019 08:00 - 09:00 | 0 | 0 | 0 | 0 |
| 31.12.2019 09:00 - 10:00 | 0 | 0 | 0 | 0 |
| 31.12.2019 10:00 - 11:00 | 0 | 0 | 0 | 0 |
| 31.12.2019 11:00 - 12:00 | 0 | 0 | 0 | 0 |
| 31.12.2019 12:00 - 13:00 | 0 | 0 | 0 | 0 |
| 31.12.2019 13:00 - 14:00 | 0 | 0 | 0 | 0 |
| 31.12.2019 14:00 - 15:00 | 0 | -300 | 0 | 0 |
| 31.12.2019 15:00 - 16:00 | 0 | -300 | 0 | 0 |
| 31.12.2019 16:00 - 17:00 | 0 | -300 | 0 | 0 |
| 31.12.2019 17:00 - 18:00 | 0 | -300 | 0 | 0 |
| 31.12.2019 18:00 - 19:00 | 0 | -433 | 0 | 0 |
| 31.12.2019 19:00 - 20:00 | 0 | -1100 | 0 | 0 |
| 31.12.2019 20:00 - 21:00 | 0 | -1100 | 0 | 0 |
| 31.12.2019 21:00 - 22:00 | 0 | -1100 | 0 | 0 |
| 31.12.2019 22:00 - 23:00 | 0 | -1100 | 0 | 0 |
| 31.12.2019 23:00 - 24:00 | 0 | -1500 | 0 | 0 |
| 01.01.2020 00:00 - 01:00 | 0 | -1500 | 0 | 0 |
| 01.01.2020 01:00 - 02:00 | 0 | -1500 | 0 | 0 |
| 01.01.2020 02:00 - 03:00 | 0 | -2500 | 0 | 0 |
| 01.01.2020 03:00 - 04:00 | 0 | -2500 | 0 | 0 |
| 01.01.2020 04:00 - 05:00 | 0 | -2500 | 0 | 0 |
| 01.01.2020 05:00 - 06:00 | 0 | -2500 | 0 | 0 |